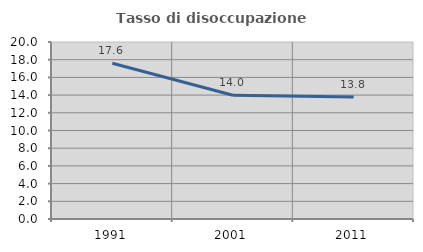
| Category | Tasso di disoccupazione giovanile  |
|---|---|
| 1991.0 | 17.606 |
| 2001.0 | 13.978 |
| 2011.0 | 13.793 |